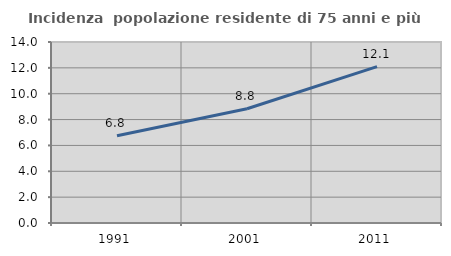
| Category | Incidenza  popolazione residente di 75 anni e più |
|---|---|
| 1991.0 | 6.753 |
| 2001.0 | 8.841 |
| 2011.0 | 12.099 |